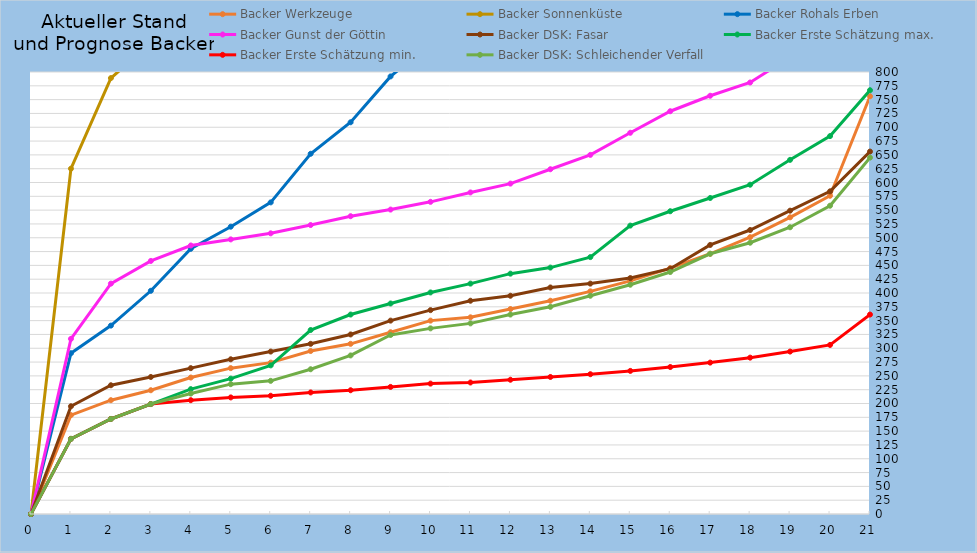
| Category | Backer Werkzeuge | Backer Sonnenküste | Backer Rohals Erben | Backer Gunst der Göttin | Backer DSK: Fasar | Backer Erste Schätzung max. | Backer Erste Schätzung min. | Backer DSK: Schleichender Verfall |
|---|---|---|---|---|---|---|---|---|
| 0.0 | 0 | 0 | 0 | 0 | 0 | 0 | 0 | 0 |
| 1.0 | 179 | 625 | 291 | 317 | 195 | 136 | 136 | 136 |
| 2.0 | 206 | 789 | 341 | 417 | 233 | 172 | 172 | 172 |
| 3.0 | 224 | 852 | 404 | 458 | 248 | 199 | 199 | 199 |
| 4.0 | 247 | 891 | 480 | 486 | 264 | 226 | 206 | 218 |
| 5.0 | 264 | 918 | 520 | 497 | 280 | 245 | 211 | 235 |
| 6.0 | 274 | 953 | 564 | 508 | 294 | 269 | 214 | 241 |
| 7.0 | 295 | 1044 | 652 | 523 | 308 | 333 | 220 | 262 |
| 8.0 | 308 | 1084 | 709 | 539 | 325 | 361 | 224 | 287 |
| 9.0 | 329 | 1112 | 792 | 551 | 350 | 381 | 230 | 324 |
| 10.0 | 350 | 1140 | 851 | 565 | 369 | 401 | 236 | 336 |
| 11.0 | 356 | 1163 | 893 | 582 | 386 | 417 | 238 | 345 |
| 12.0 | 371 | 1189 | 935 | 598 | 395 | 435 | 243 | 361 |
| 13.0 | 386 | 1205 | 976 | 624 | 410 | 446 | 248 | 375 |
| 14.0 | 403 | 1232 | 1011 | 650 | 417 | 465 | 253 | 395 |
| 15.0 | 422 | 1313 | 1060 | 690 | 427 | 522 | 259 | 415 |
| 16.0 | 445 | 1350 | 1096 | 729 | 444 | 548 | 266 | 438 |
| 17.0 | 471 | 1384 | 1134 | 757 | 487 | 572 | 274 | 471 |
| 18.0 | 501 | 1419 | 1160 | 781 | 514 | 596 | 283 | 491 |
| 19.0 | 537 | 1483 | 1210 | 827 | 549 | 641 | 294 | 519 |
| 20.0 | 576 | 1545 | 1290 | 863 | 584 | 684 | 306 | 558 |
| 21.0 | 756 | 1664 | 1421 | 972 | 656 | 767 | 361 | 645 |